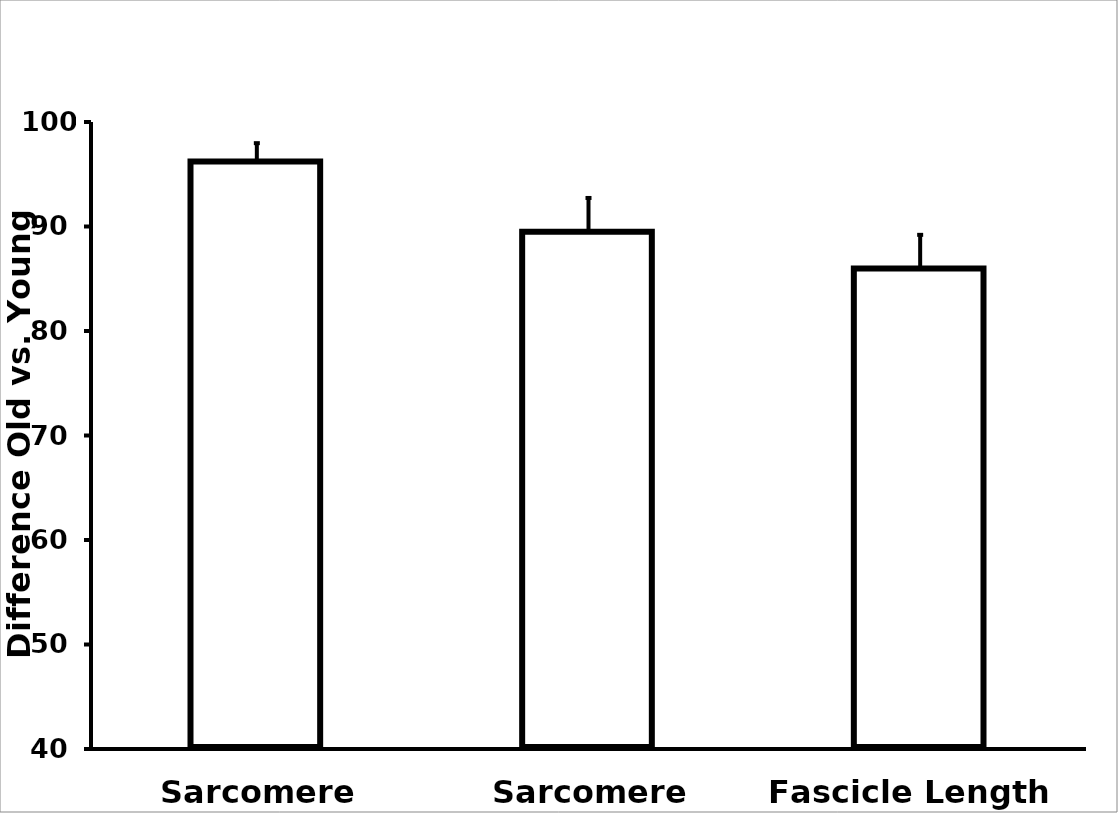
| Category | Series 0 |
|---|---|
| Sarcomere Length | 96.23 |
| Sarcomere Number | 89.495 |
| Fascicle Length  | 85.987 |